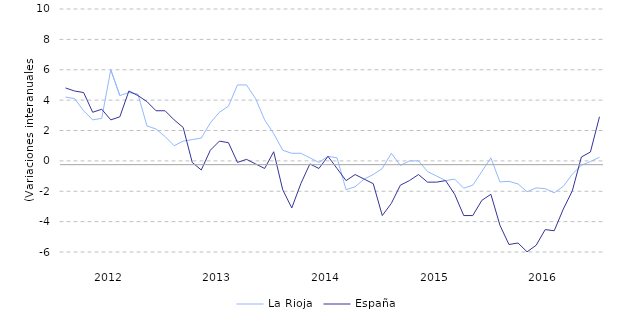
| Category | La Rioja | España |
|---|---|---|
| nan | 4.2 | 4.8 |
| nan | 4.1 | 4.6 |
| nan | 3.3 | 4.5 |
| nan | 2.7 | 3.2 |
| nan | 2.8 | 3.4 |
| 2012.0 | 6 | 2.7 |
| nan | 4.3 | 2.9 |
| nan | 4.5 | 4.6 |
| nan | 4.4 | 4.3 |
| nan | 2.3 | 3.9 |
| nan | 2.1 | 3.3 |
| nan | 1.6 | 3.3 |
| nan | 1 | 2.7 |
| nan | 1.3 | 2.2 |
| nan | 1.4 | -0.1 |
| nan | 1.5 | -0.6 |
| nan | 2.5 | 0.7 |
| 2013.0 | 3.2 | 1.3 |
| nan | 3.6 | 1.2 |
| nan | 5 | -0.1 |
| nan | 5 | 0.1 |
| nan | 4.1 | -0.2 |
| nan | 2.7 | -0.5 |
| nan | 1.8 | 0.6 |
| nan | 0.7 | -1.9 |
| nan | 0.5 | -3.1 |
| nan | 0.5 | -1.5 |
| nan | 0.2 | -0.2 |
| nan | -0.1 | -0.5 |
| 2014.0 | 0.3 | 0.3 |
| nan | 0.2 | -0.5 |
| nan | -1.9 | -1.3 |
| nan | -1.7 | -0.9 |
| nan | -1.2 | -1.2 |
| nan | -0.9 | -1.5 |
| nan | -0.5 | -3.6 |
| nan | 0.5 | -2.8 |
| nan | -0.3 | -1.6 |
| nan | 0 | -1.3 |
| nan | 0 | -0.9 |
| nan | -0.7 | -1.4 |
| 2015.0 | -1 | -1.4 |
| nan | -1.3 | -1.3 |
| nan | -1.2 | -2.2 |
| nan | -1.8 | -3.6 |
| nan | -1.6 | -3.6 |
| nan | -0.7 | -2.6 |
| nan | 0.2 | -2.2 |
| nan | -1.386 | -4.238 |
| nan | -1.35 | -5.506 |
| nan | -1.517 | -5.407 |
| nan | -2.033 | -5.988 |
| nan | -1.781 | -5.558 |
| 2016.0 | -1.828 | -4.525 |
| nan | -2.103 | -4.601 |
| nan | -1.678 | -3.181 |
| nan | -0.875 | -1.972 |
| nan | -0.287 | 0.254 |
| nan | -0.045 | 0.584 |
| nan | 0.243 | 2.903 |